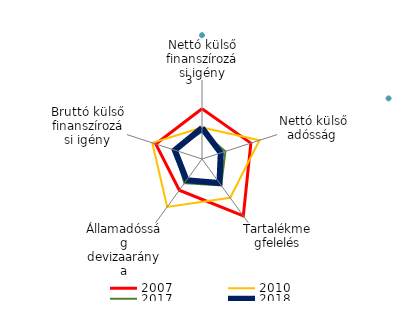
| Category | 2007 | 2008 | 2010 | 2017 | 2018 |
|---|---|---|---|---|---|
| Nettó külső finanszírozási igény | 0.814 |  | -0.613 | -0.92 | -0.639 |
| Nettó külső adósság  | 0.901 |  | 1.591 | -1.128 | -1.501 |
| Tartalékmegfelelés | 2.337 |  | 0.644 | -0.522 | -0.744 |
| Államadósság devizaaránya | -0.071 |  | 1.498 | -0.728 | -1.005 |
| Bruttó külső finanszírozási igény | 0.694 |  | 0.97 | -0.798 | -0.826 |